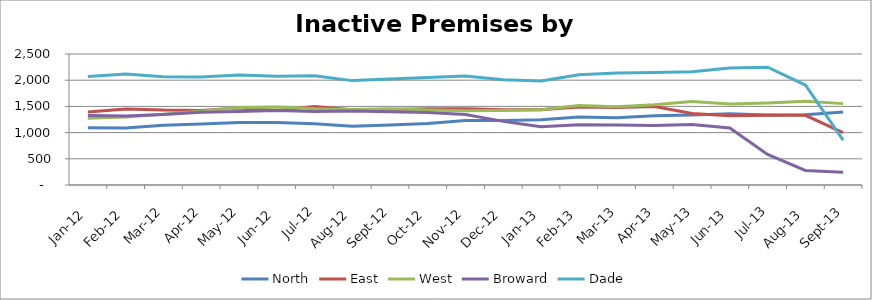
| Category | North | East | West | Broward | Dade |
|---|---|---|---|---|---|
| 2012-01-01 | 1094 | 1394 | 1276 | 1328 | 2072 |
| 2012-02-01 | 1086 | 1452 | 1298 | 1315 | 2116 |
| 2012-03-01 | 1141 | 1429 | 1351 | 1347 | 2067 |
| 2012-04-01 | 1165 | 1424 | 1406 | 1386 | 2060 |
| 2012-05-01 | 1191 | 1469 | 1480 | 1404 | 2101 |
| 2012-06-01 | 1193 | 1422 | 1489 | 1424 | 2075 |
| 2012-07-01 | 1168 | 1497 | 1456 | 1402 | 2087 |
| 2012-08-01 | 1122 | 1435 | 1442 | 1411 | 1992 |
| 2012-09-01 | 1145 | 1443 | 1453 | 1396 | 2024 |
| 2012-10-01 | 1176 | 1456 | 1432 | 1383 | 2053 |
| 2012-11-01 | 1230 | 1454 | 1419 | 1346 | 2082 |
| 2012-12-01 | 1233 | 1436 | 1420 | 1214 | 2007 |
| 2013-01-01 | 1245 | 1435 | 1434 | 1114 | 1986 |
| 2013-02-01 | 1298 | 1488 | 1517 | 1148 | 2105 |
| 2013-03-01 | 1282 | 1479 | 1495 | 1146 | 2136 |
| 2013-04-01 | 1323 | 1496 | 1533 | 1137 | 2147 |
| 2013-05-01 | 1336 | 1366 | 1595 | 1155 | 2162 |
| 2013-06-01 | 1358 | 1321 | 1547 | 1089 | 2235 |
| 2013-07-01 | 1335 | 1332 | 1567 | 584 | 2248 |
| 2013-08-01 | 1341 | 1330 | 1597 | 278 | 1908 |
| 2013-09-01 | 1395 | 1000 | 1553 | 245 | 857 |